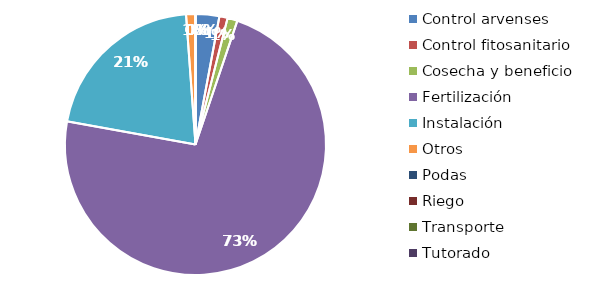
| Category | Valor |
|---|---|
| Control arvenses | 496690 |
| Control fitosanitario | 172985 |
| Cosecha y beneficio | 208868.28 |
| Fertilización | 12290308 |
| Instalación | 3553154.047 |
| Otros | 195800 |
| Podas | 0 |
| Riego | 0 |
| Transporte | 0 |
| Tutorado | 0 |